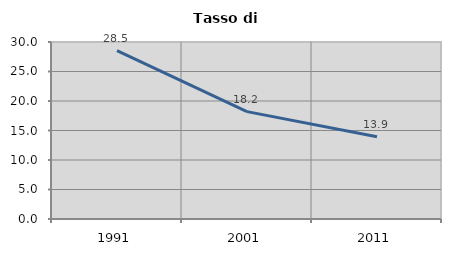
| Category | Tasso di disoccupazione   |
|---|---|
| 1991.0 | 28.53 |
| 2001.0 | 18.202 |
| 2011.0 | 13.932 |